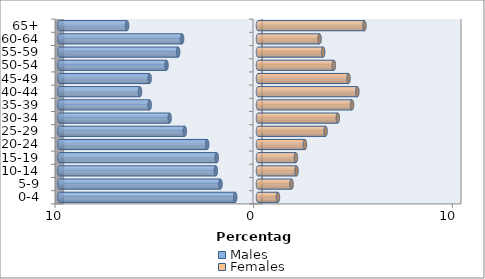
| Category | Males | Females |
|---|---|---|
| 0-4 | -1.149 | 1.004 |
| 5-9 | -1.889 | 1.691 |
| 10-14 | -2.124 | 1.94 |
| 15-19 | -2.077 | 1.91 |
| 20-24 | -2.559 | 2.362 |
| 25-29 | -3.687 | 3.403 |
| 30-34 | -4.448 | 4.017 |
| 35-39 | -5.452 | 4.734 |
| 40-44 | -5.941 | 5.002 |
| 45-49 | -5.456 | 4.556 |
| 50-54 | -4.605 | 3.818 |
| 55-59 | -4.021 | 3.282 |
| 60-64 | -3.822 | 3.101 |
| 65+ | -6.591 | 5.359 |